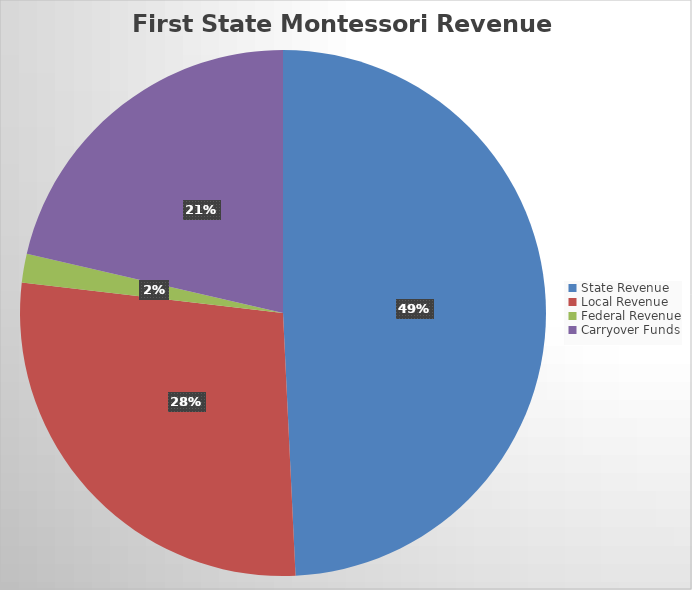
| Category | Series 0 |
|---|---|
| State Revenue | 6229657.13 |
| Local Revenue | 3493222.32 |
| Federal Revenue | 223890 |
| Carryover Funds | 2704941.32 |